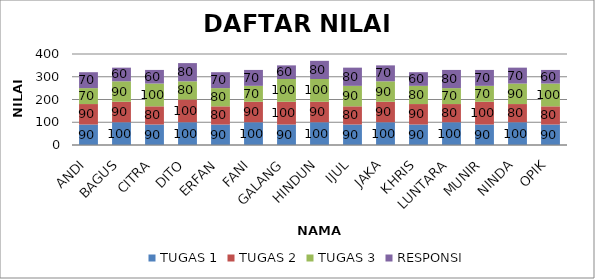
| Category | TUGAS 1 | TUGAS 2 | TUGAS 3 | RESPONSI |
|---|---|---|---|---|
| ANDI | 90 | 90 | 70 | 70 |
| BAGUS | 100 | 90 | 90 | 60 |
| CITRA | 90 | 80 | 100 | 60 |
| DITO | 100 | 100 | 80 | 80 |
| ERFAN | 90 | 80 | 80 | 70 |
| FANI | 100 | 90 | 70 | 70 |
| GALANG | 90 | 100 | 100 | 60 |
| HINDUN | 100 | 90 | 100 | 80 |
| IJUL | 90 | 80 | 90 | 80 |
| JAKA | 100 | 90 | 90 | 70 |
| KHRIS | 90 | 90 | 80 | 60 |
| LUNTARA | 100 | 80 | 70 | 80 |
| MUNIR | 90 | 100 | 70 | 70 |
| NINDA | 100 | 80 | 90 | 70 |
| OPIK | 90 | 80 | 100 | 60 |